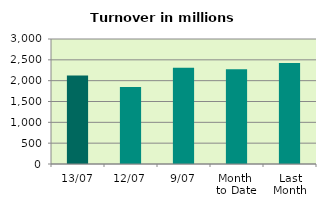
| Category | Series 0 |
|---|---|
| 13/07 | 2125.023 |
| 12/07 | 1849.961 |
| 9/07 | 2309.098 |
| Month 
to Date | 2275.751 |
| Last
Month | 2424.747 |